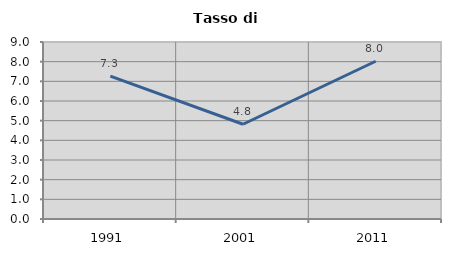
| Category | Tasso di disoccupazione   |
|---|---|
| 1991.0 | 7.264 |
| 2001.0 | 4.818 |
| 2011.0 | 8.022 |